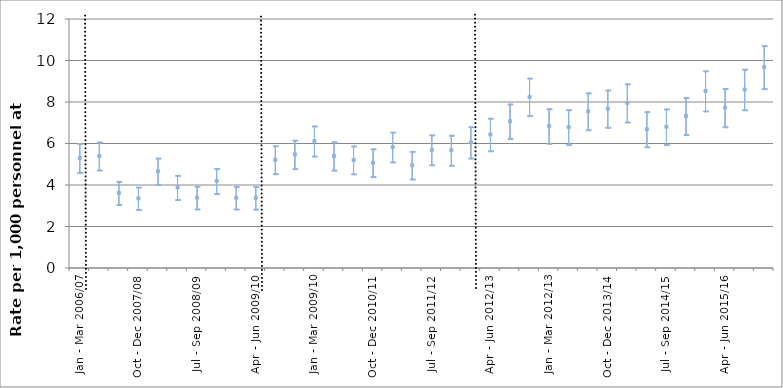
| Category | Rate of patients assessed with a mental disorder | 95% LL | 95% UL |
|---|---|---|---|
| Jan - Mar 2006/07 | 5.3 | 4.6 | 6 |
| Apr - Jun 2007/08 | 5.399 | 4.723 | 6.075 |
| Jul - Sep 2007/08 | 3.617 | 3.06 | 4.174 |
| Oct - Dec 2007/08 | 3.36 | 2.821 | 3.9 |
| Jan - Mar 2007/08 | 4.662 | 4.024 | 5.3 |
| Apr - Jun 2008/09 | 3.881 | 3.297 | 4.464 |
| Jul - Sep 2008/09 | 3.391 | 2.845 | 3.938 |
| Oct - Dec 2008/09 | 4.191 | 3.584 | 4.798 |
| Jan - Mar 2008/09 | 3.385 | 2.84 | 3.93 |
| Apr - Jun 2009/10 | 3.383 | 2.84 | 3.926 |
| Jul - Sep 2009/10 | 5.218 | 4.545 | 5.891 |
| Oct - Dec 2009/10 | 5.474 | 4.787 | 6.161 |
| Jan - Mar 2009/10 | 6.12 | 5.394 | 6.846 |
| Apr - Jun 2010/11 | 5.399 | 4.716 | 6.082 |
| Jul - Sep 2010/11 | 5.208 | 4.535 | 5.882 |
| Oct - Dec 2010/11 | 5.074 | 4.406 | 5.741 |
| Jan - Mar 2010/11 | 5.83 | 5.11 | 6.55 |
| Apr - Jun 2011/12 | 4.955 | 4.288 | 5.622 |
| Jul - Sep 2011/12 | 5.695 | 4.976 | 6.414 |
| Oct - Dec 2011/12 | 5.674 | 4.952 | 6.396 |
| Jan - Mar 2011/12 | 6.053 | 5.3 | 6.806 |
| Apr - Jun 2012/13 | 6.433 | 5.65 | 7.217 |
| Jul - Sep 2012/13 | 7.076 | 6.247 | 7.905 |
| Oct - Dec 2012/13 | 8.249 | 7.343 | 9.154 |
| Jan - Mar 2012/13 | 6.842 | 6.009 | 7.675 |
| Apr - Jun 2013/14 | 6.793 | 5.958 | 7.629 |
| Jul - Sep 2013/14 | 7.553 | 6.665 | 8.44 |
| Oct - Dec 2013/14 | 7.679 | 6.78 | 8.579 |
| Jan - Mar 2013/14 | 7.954 | 7.036 | 8.873 |
| Apr - Jun 2014/15 | 6.689 | 5.844 | 7.534 |
| Jul - Sep 2014/15 | 6.81 | 5.954 | 7.666 |
| Oct - Dec 2014/15 | 7.323 | 6.431 | 8.215 |
| Jan - Mar 2014/15 | 8.534 | 7.567 | 9.501 |
| Apr - Jun 2015/16 | 7.73 | 6.806 | 8.654 |
| Jul - Sep 2015/16 | 8.601 | 7.625 | 9.578 |
| Oct - Dec 2015/16 | 9.681 | 8.644 | 10.718 |